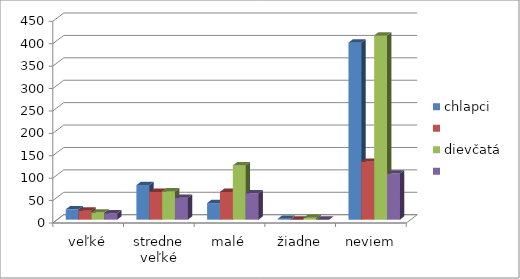
| Category | chlapci | Series 1 | dievčatá | Series 3 |
|---|---|---|---|---|
| veľké | 23 | 20 | 16 | 14 |
| stredne veľké | 77 | 62 | 63 | 49 |
| malé | 37 | 62 | 121 | 59 |
| žiadne | 2 | 0 | 4 | 0 |
| neviem | 395 | 129 | 411 | 103 |